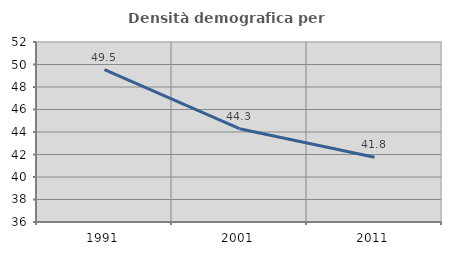
| Category | Densità demografica |
|---|---|
| 1991.0 | 49.538 |
| 2001.0 | 44.297 |
| 2011.0 | 41.761 |